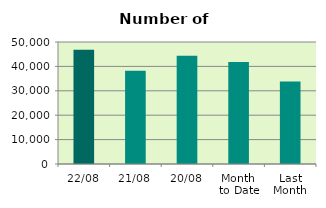
| Category | Series 0 |
|---|---|
| 22/08 | 46846 |
| 21/08 | 38170 |
| 20/08 | 44368 |
| Month 
to Date | 41836.375 |
| Last
Month | 33803.652 |